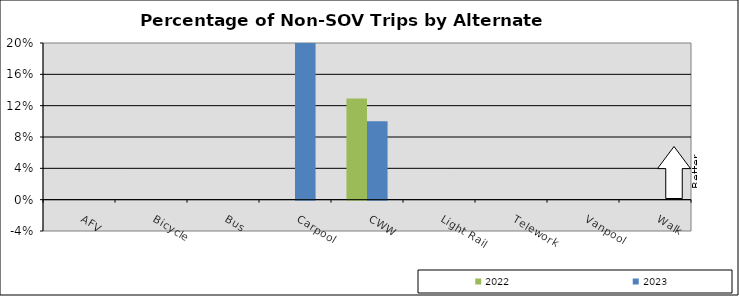
| Category | 2022 | 2023 |
|---|---|---|
| AFV | 0 | 0 |
| Bicycle | 0 | 0 |
| Bus | 0 | 0 |
| Carpool | 0 | 0.2 |
| CWW | 0.129 | 0.1 |
| Light Rail | 0 | 0 |
| Telework | 0 | 0 |
| Vanpool | 0 | 0 |
| Walk | 0 | 0 |